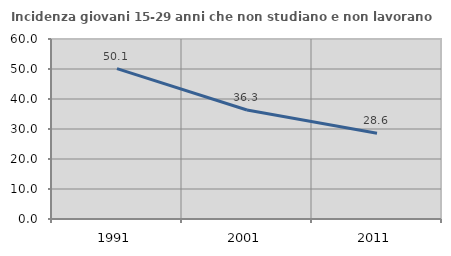
| Category | Incidenza giovani 15-29 anni che non studiano e non lavorano  |
|---|---|
| 1991.0 | 50.103 |
| 2001.0 | 36.344 |
| 2011.0 | 28.609 |